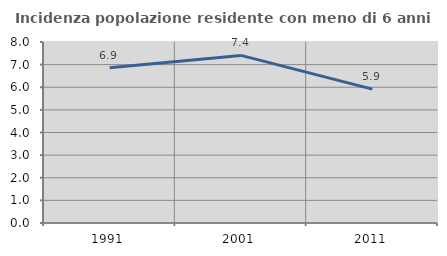
| Category | Incidenza popolazione residente con meno di 6 anni |
|---|---|
| 1991.0 | 6.864 |
| 2001.0 | 7.407 |
| 2011.0 | 5.916 |